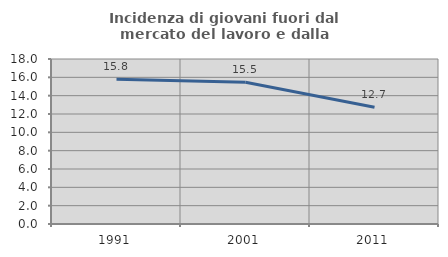
| Category | Incidenza di giovani fuori dal mercato del lavoro e dalla formazione  |
|---|---|
| 1991.0 | 15.786 |
| 2001.0 | 15.462 |
| 2011.0 | 12.73 |